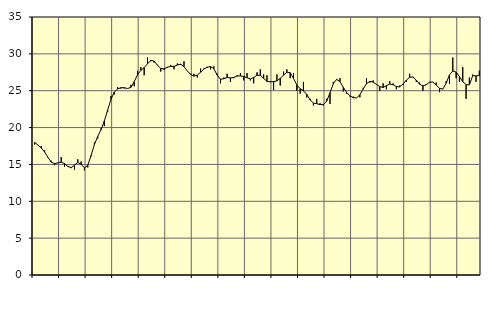
| Category | Piggar | Series 1 |
|---|---|---|
| nan | 17.7 | 17.99 |
| 87.0 | 17.6 | 17.63 |
| 87.0 | 17.5 | 17.23 |
| 87.0 | 16.9 | 16.69 |
| nan | 15.9 | 15.96 |
| 88.0 | 15.5 | 15.31 |
| 88.0 | 14.9 | 15.1 |
| 88.0 | 15.2 | 15.21 |
| nan | 16 | 15.3 |
| 89.0 | 14.7 | 15.12 |
| 89.0 | 14.8 | 14.72 |
| 89.0 | 14.5 | 14.57 |
| nan | 14.3 | 14.9 |
| 90.0 | 15.7 | 15.26 |
| 90.0 | 15.4 | 15.03 |
| 90.0 | 14.2 | 14.53 |
| nan | 14.6 | 14.87 |
| 91.0 | 16.1 | 16.2 |
| 91.0 | 18 | 17.69 |
| 91.0 | 18.5 | 18.8 |
| nan | 19.9 | 19.7 |
| 92.0 | 20.2 | 20.9 |
| 92.0 | 22.1 | 22.39 |
| 92.0 | 24.3 | 23.83 |
| nan | 24.5 | 24.81 |
| 93.0 | 25.5 | 25.24 |
| 93.0 | 25.3 | 25.41 |
| 93.0 | 25.3 | 25.41 |
| nan | 25.3 | 25.3 |
| 94.0 | 25.8 | 25.45 |
| 94.0 | 25.6 | 26.22 |
| 94.0 | 27.7 | 27.16 |
| nan | 28.2 | 27.76 |
| 95.0 | 27.1 | 28.14 |
| 95.0 | 29.5 | 28.64 |
| 95.0 | 29 | 29.11 |
| nan | 28.8 | 29.02 |
| 96.0 | 28.5 | 28.46 |
| 96.0 | 27.6 | 28.02 |
| 96.0 | 27.8 | 27.97 |
| nan | 28.1 | 28.18 |
| 97.0 | 28.5 | 28.3 |
| 97.0 | 27.9 | 28.3 |
| 97.0 | 28.7 | 28.48 |
| nan | 28.5 | 28.6 |
| 98.0 | 29 | 28.27 |
| 98.0 | 27.7 | 27.69 |
| 98.0 | 27.3 | 27.21 |
| nan | 27.3 | 26.98 |
| 99.0 | 26.8 | 27.12 |
| 99.0 | 28 | 27.5 |
| 99.0 | 28 | 27.94 |
| nan | 28.1 | 28.19 |
| 0.0 | 27.9 | 28.28 |
| 0.0 | 28.3 | 27.98 |
| 0.0 | 27.3 | 27.12 |
| nan | 26 | 26.56 |
| 1.0 | 26.8 | 26.62 |
| 1.0 | 27.3 | 26.79 |
| 1.0 | 26.2 | 26.74 |
| nan | 26.7 | 26.8 |
| 2.0 | 27.1 | 26.99 |
| 2.0 | 27.4 | 27.01 |
| 2.0 | 26.4 | 26.94 |
| nan | 27.4 | 26.76 |
| 3.0 | 26.4 | 26.59 |
| 3.0 | 26 | 26.79 |
| 3.0 | 27.5 | 27.1 |
| nan | 27.9 | 27.09 |
| 4.0 | 27.2 | 26.68 |
| 4.0 | 27.1 | 26.27 |
| 4.0 | 26.3 | 26.21 |
| nan | 25.1 | 26.24 |
| 5.0 | 27.2 | 26.33 |
| 5.0 | 25.7 | 26.68 |
| 5.0 | 27.6 | 27.11 |
| nan | 27.9 | 27.5 |
| 6.0 | 26.7 | 27.45 |
| 6.0 | 27.4 | 26.67 |
| 6.0 | 25 | 25.79 |
| nan | 24.6 | 25.28 |
| 7.0 | 26.2 | 24.99 |
| 7.0 | 24.1 | 24.5 |
| 7.0 | 23.9 | 23.75 |
| nan | 23 | 23.33 |
| 8.0 | 23.9 | 23.24 |
| 8.0 | 23.3 | 23.11 |
| 8.0 | 23 | 23.13 |
| nan | 23.9 | 23.59 |
| 9.0 | 23.2 | 24.72 |
| 9.0 | 26.2 | 25.97 |
| 9.0 | 26.6 | 26.53 |
| nan | 26.7 | 26.23 |
| 10.0 | 24.9 | 25.46 |
| 10.0 | 24.6 | 24.77 |
| 10.0 | 24.2 | 24.32 |
| nan | 24.2 | 24.05 |
| 11.0 | 24 | 24.03 |
| 11.0 | 24.1 | 24.44 |
| 11.0 | 25.4 | 25.22 |
| nan | 26.7 | 25.95 |
| 12.0 | 26.1 | 26.28 |
| 12.0 | 26.4 | 26.16 |
| 12.0 | 25.8 | 25.86 |
| nan | 25 | 25.55 |
| 13.0 | 26 | 25.44 |
| 13.0 | 25.2 | 25.69 |
| 13.0 | 26.3 | 25.91 |
| nan | 26 | 25.81 |
| 14.0 | 25.2 | 25.56 |
| 14.0 | 25.7 | 25.52 |
| 14.0 | 25.8 | 25.91 |
| nan | 26.2 | 26.44 |
| 15.0 | 27.3 | 26.82 |
| 15.0 | 26.9 | 26.85 |
| 15.0 | 26.2 | 26.44 |
| nan | 26.1 | 25.88 |
| 16.0 | 25 | 25.66 |
| 16.0 | 25.9 | 25.81 |
| 16.0 | 26.2 | 26.15 |
| nan | 26.2 | 26.17 |
| 17.0 | 26.1 | 25.77 |
| 17.0 | 24.8 | 25.31 |
| 17.0 | 25.2 | 25.23 |
| nan | 26.3 | 26.01 |
| 18.0 | 25.9 | 27.15 |
| 18.0 | 29.5 | 27.67 |
| 18.0 | 26.7 | 27.53 |
| nan | 26.2 | 26.92 |
| 19.0 | 28.2 | 26.22 |
| 19.0 | 23.9 | 25.83 |
| 19.0 | 26.8 | 25.78 |
| nan | 27.2 | 27.04 |
| 20.0 | 26.2 | 27.01 |
| 20.0 | 27.7 | 27.05 |